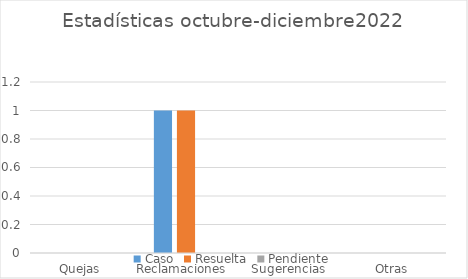
| Category | Caso | Resuelta | Pendiente |
|---|---|---|---|
| Quejas | 0 | 0 | 0 |
| Reclamaciones  | 1 | 1 | 0 |
| Sugerencias | 0 | 0 | 0 |
| Otras | 0 | 0 | 0 |